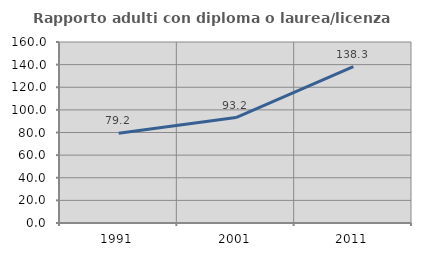
| Category | Rapporto adulti con diploma o laurea/licenza media  |
|---|---|
| 1991.0 | 79.241 |
| 2001.0 | 93.172 |
| 2011.0 | 138.326 |